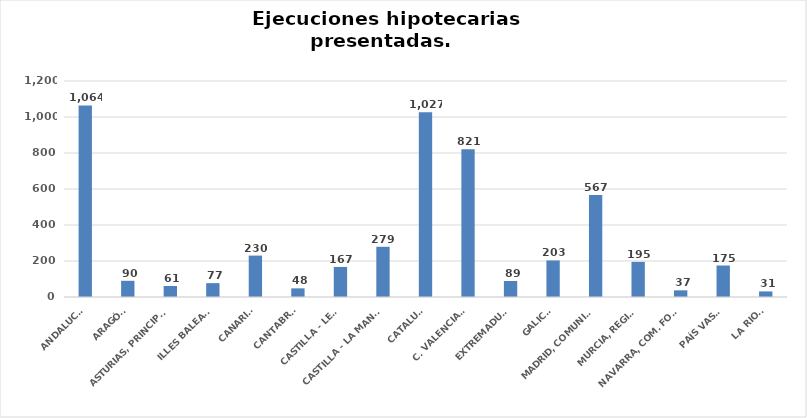
| Category | Series 0 |
|---|---|
| ANDALUCÍA | 1064 |
| ARAGÓN | 90 |
| ASTURIAS, PRINCIPADO | 61 |
| ILLES BALEARS | 77 |
| CANARIAS | 230 |
| CANTABRIA | 48 |
| CASTILLA - LEÓN | 167 |
| CASTILLA - LA MANCHA | 279 |
| CATALUÑA | 1027 |
| C. VALENCIANA | 821 |
| EXTREMADURA | 89 |
| GALICIA | 203 |
| MADRID, COMUNIDAD | 567 |
| MURCIA, REGIÓN | 195 |
| NAVARRA, COM. FORAL | 37 |
| PAÍS VASCO | 175 |
| LA RIOJA | 31 |